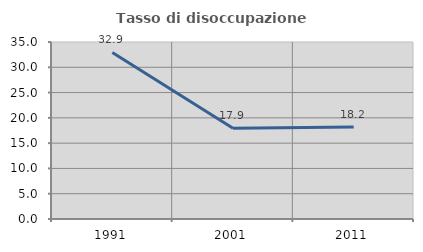
| Category | Tasso di disoccupazione giovanile  |
|---|---|
| 1991.0 | 32.927 |
| 2001.0 | 17.949 |
| 2011.0 | 18.182 |